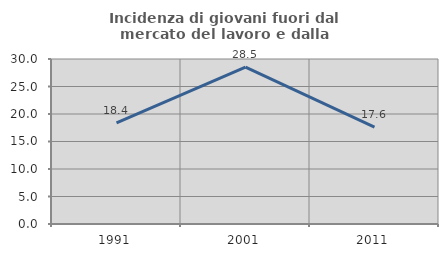
| Category | Incidenza di giovani fuori dal mercato del lavoro e dalla formazione  |
|---|---|
| 1991.0 | 18.408 |
| 2001.0 | 28.517 |
| 2011.0 | 17.63 |